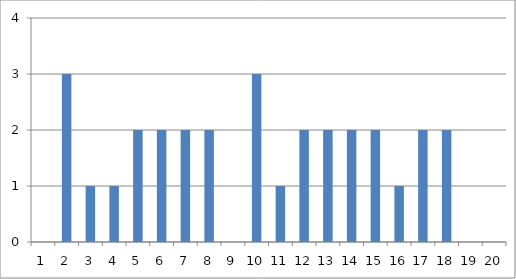
| Category | Series 0 |
|---|---|
| 0 | 0 |
| 1 | 3 |
| 2 | 1 |
| 3 | 1 |
| 4 | 2 |
| 5 | 2 |
| 6 | 2 |
| 7 | 2 |
| 8 | 0 |
| 9 | 3 |
| 10 | 1 |
| 11 | 2 |
| 12 | 2 |
| 13 | 2 |
| 14 | 2 |
| 15 | 1 |
| 16 | 2 |
| 17 | 2 |
| 18 | 0 |
| 19 | 0 |